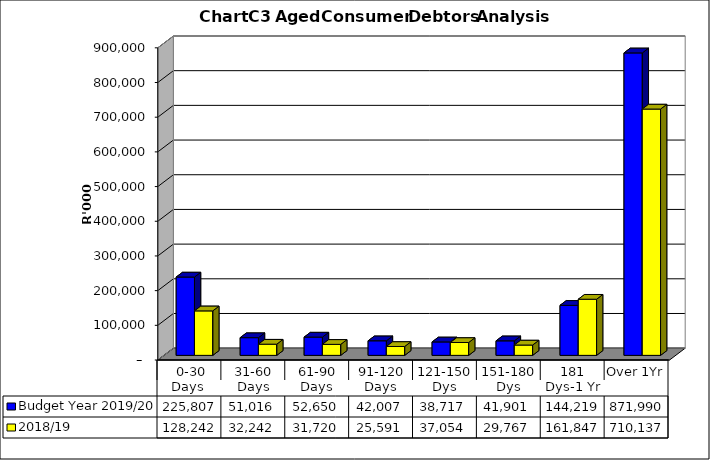
| Category | Budget Year 2019/20 | 2018/19 |
|---|---|---|
|  0-30 Days  | 225807398 | 128242258.49 |
| 31-60 Days | 51015758 | 32241887.02 |
| 61-90 Days | 52650277 | 31719869.88 |
| 91-120 Days | 42007013 | 25591176.59 |
| 121-150 Dys | 38716756 | 37053581.67 |
| 151-180 Dys | 41900738 | 29766745.57 |
| 181 Dys-1 Yr | 144219369 | 161847121.47 |
| Over 1Yr | 871990436 | 710136947.69 |